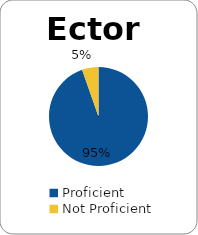
| Category | Series 0 |
|---|---|
| Proficient | 0.946 |
| Not Proficient | 0.054 |